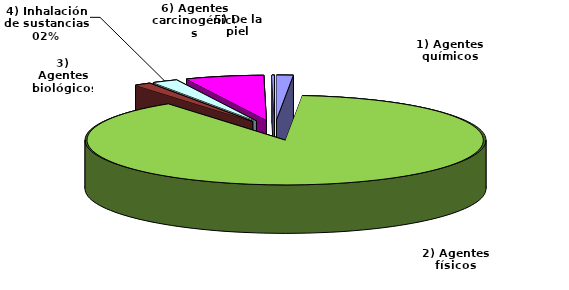
| Category | Total nº |
|---|---|
| 1) Agentes químicos | 13 |
| 2) Agentes físicos | 857 |
| 3) Agentes biológicos | 13 |
| 4) Inhalación de sustancias | 20 |
| 5) De la piel | 61 |
| 6) Agentes carcinogénicos | 2 |